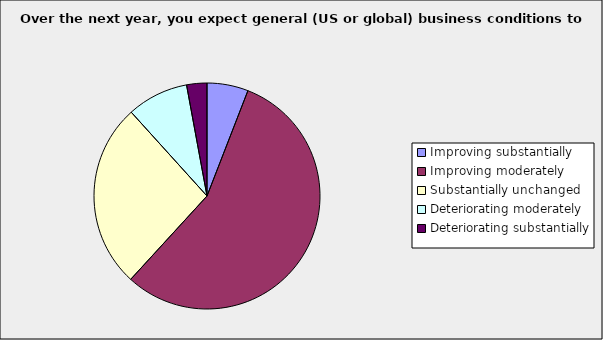
| Category | Series 0 |
|---|---|
| Improving substantially | 0.059 |
| Improving moderately | 0.559 |
| Substantially unchanged | 0.265 |
| Deteriorating moderately | 0.088 |
| Deteriorating substantially | 0.029 |